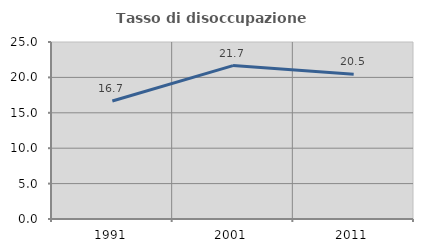
| Category | Tasso di disoccupazione giovanile  |
|---|---|
| 1991.0 | 16.667 |
| 2001.0 | 21.667 |
| 2011.0 | 20.455 |